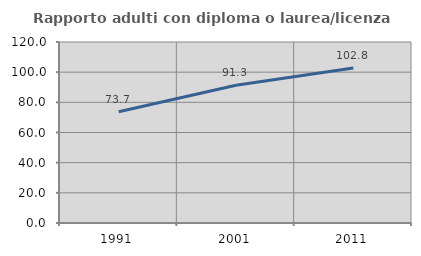
| Category | Rapporto adulti con diploma o laurea/licenza media  |
|---|---|
| 1991.0 | 73.716 |
| 2001.0 | 91.337 |
| 2011.0 | 102.801 |